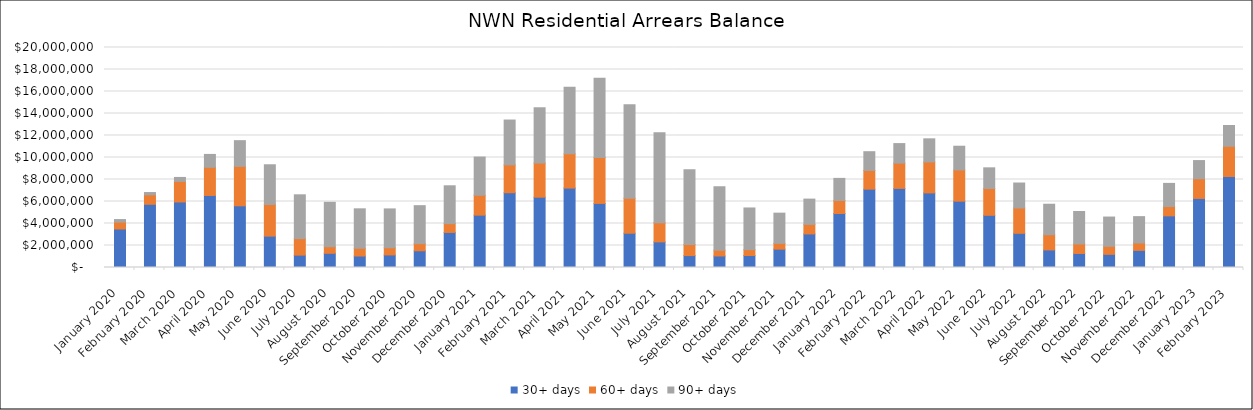
| Category | 30+ days | 60+ days | 90+ days |
|---|---|---|---|
| 2020-01-01 | 3500764.69 | 629181.51 | 228032.49 |
| 2020-02-01 | 5747850.47 | 857364.02 | 208368.78 |
| 2020-03-01 | 5957147.43 | 1866170.68 | 364331.63 |
| 2020-04-01 | 6548410.91 | 2561223.13 | 1169852.28 |
| 2020-05-01 | 5607591.92 | 3587088.92 | 2336913.27 |
| 2020-06-01 | 2852261.51 | 2876381.02 | 3610969.54 |
| 2020-07-01 | 1122726.39 | 1506319.55 | 3979714.68 |
| 2020-08-01 | 1288858.82 | 599518.47 | 4038252.27 |
| 2020-09-01 | 1044416.33 | 704127.88 | 3585461.82 |
| 2020-10-01 | 1142496 | 651431 | 3531977 |
| 2020-11-01 | 1520366 | 649770 | 3450928 |
| 2020-12-01 | 3186323 | 802127 | 3439513 |
| 2021-01-01 | 4757163 | 1811898 | 3472826 |
| 2021-02-01 | 6797409 | 2531974 | 4076333 |
| 2021-03-01 | 6390932 | 3104764 | 5025543 |
| 2021-04-01 | 7220521 | 3116190 | 6050362 |
| 2021-05-01 | 5824486.4 | 4170936.57 | 7212221.09 |
| 2021-06-01 | 3115370.01 | 3173423.22 | 8513291.28 |
| 2021-07-01 | 2327943 | 1747809 | 8171934 |
| 2021-08-01 | 1082040.39 | 1006983.88 | 6791285.13 |
| 2021-09-01 | 1047636 | 528886 | 5758891 |
| 2021-10-01 | 1088659.91 | 533442.32 | 3790092.24 |
| 2021-11-01 | 1667932.64 | 525524.69 | 2748418.1 |
| 2021-12-01 | 3050152.33 | 868149.27 | 2298728.18 |
| 2022-01-01 | 4910766.15 | 1182837.68 | 2007241.57 |
| 2022-02-01 | 7122212.76 | 1699772.57 | 1705372.48 |
| 2022-03-01 | 7190613.7 | 2294593.5 | 1779152.63 |
| 2022-04-01 | 6780016.4 | 2817058.54 | 2099357.56 |
| 2022-05-01 | 6029907 | 2839298 | 2156099 |
| 2022-06-01 | 4744451.34 | 2435978.34 | 1880011.18 |
| 2022-07-01 | 3105951.13 | 2304039.01 | 2269768 |
| 2022-08-01 | 1594623.68 | 1386052.73 | 2770149.44 |
| 2022-09-01 | 1275436.66 | 864958.43 | 2952402.58 |
| 2022-10-01 | 1195786.92 | 729255.14 | 2661189.83 |
| 2022-11-01 | 1554700.16 | 673162.11 | 2396179.35 |
| 2022-12-01 | 4694444.89 | 848884.08 | 2102553.08 |
| 2023-01-01 | 6279403.17 | 1794160.16 | 1647502.95 |
| 2023-02-01 | 8270757.01 | 2752480.72 | 1887223 |